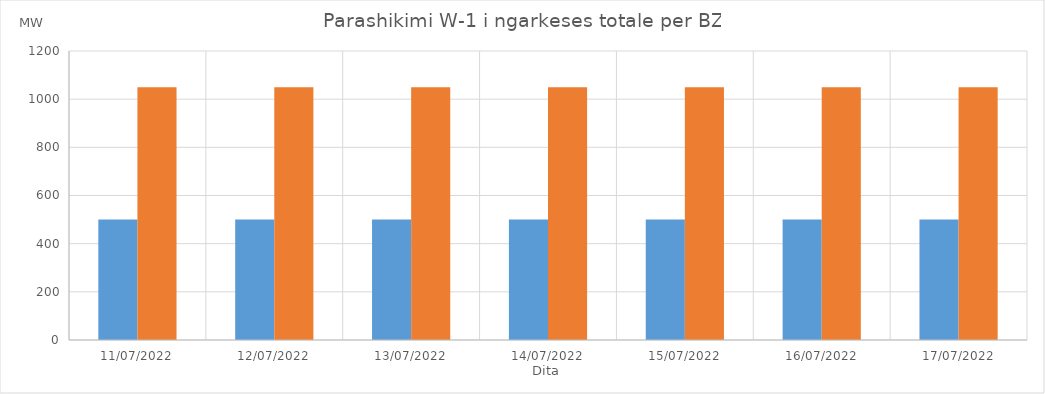
| Category | Min (MW) | Max (MW) |
|---|---|---|
| 11/07/2022 | 500 | 1050 |
| 12/07/2022 | 500 | 1050 |
| 13/07/2022 | 500 | 1050 |
| 14/07/2022 | 500 | 1050 |
| 15/07/2022 | 500 | 1050 |
| 16/07/2022 | 500 | 1050 |
| 17/07/2022 | 500 | 1050 |